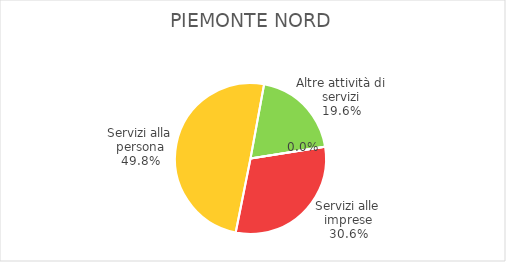
| Category | Piemonte Nord |
|---|---|
| Servizi alle imprese | 7510 |
| Servizi alla persona | 12192 |
| Altre attività di servizi | 4807 |